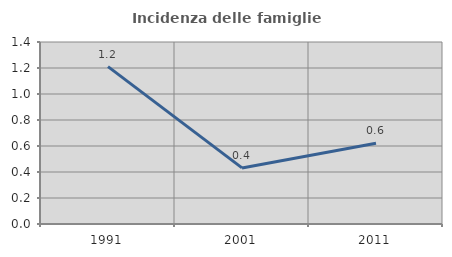
| Category | Incidenza delle famiglie numerose |
|---|---|
| 1991.0 | 1.211 |
| 2001.0 | 0.431 |
| 2011.0 | 0.621 |